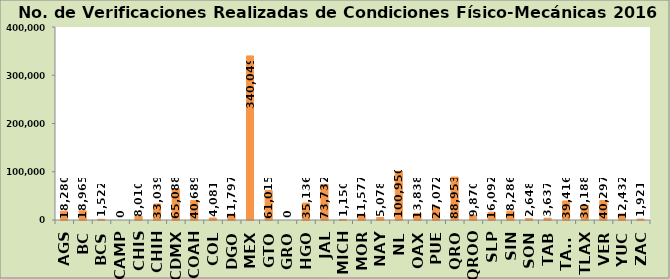
| Category | No. de Verificaciones Realizadas |
|---|---|
| AGS | 18280 |
| BC | 18965 |
| BCS | 1522 |
| CAMP | 0 |
| CHIS | 8010 |
| CHIH | 33039 |
| CDMX | 65088 |
| COAH | 40689 |
| COL | 4081 |
| DGO | 11797 |
| MEX | 340049 |
| GTO | 61015 |
| GRO | 0 |
| HGO | 35136 |
| JAL | 73732 |
| MICH | 1150 |
| MOR | 11577 |
| NAY | 5078 |
| NL | 100950 |
| OAX | 13838 |
| PUE | 27072 |
| QRO | 88953 |
| QROO | 9870 |
| SLP | 16092 |
| SIN | 18286 |
| SON | 2648 |
| TAB | 3637 |
| TAMS | 39416 |
| TLAX | 30188 |
| VER | 40297 |
| YUC | 12432 |
| ZAC | 1921 |